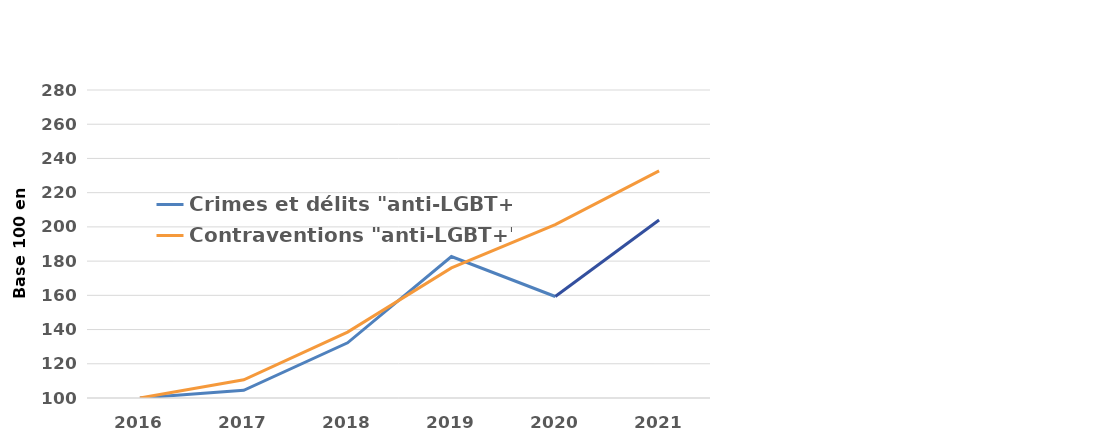
| Category | Crimes et délits "anti-LGBT+" | Contraventions "anti-LGBT+" |
|---|---|---|
| 2016.0 | 100 | 100 |
| 2017.0 | 104.511 | 110.632 |
| 2018.0 | 132.237 | 138.506 |
| 2019.0 | 182.707 | 176.006 |
| 2020.0 | 159.305 | 201.293 |
| 2021.0 | 204.041 | 232.759 |